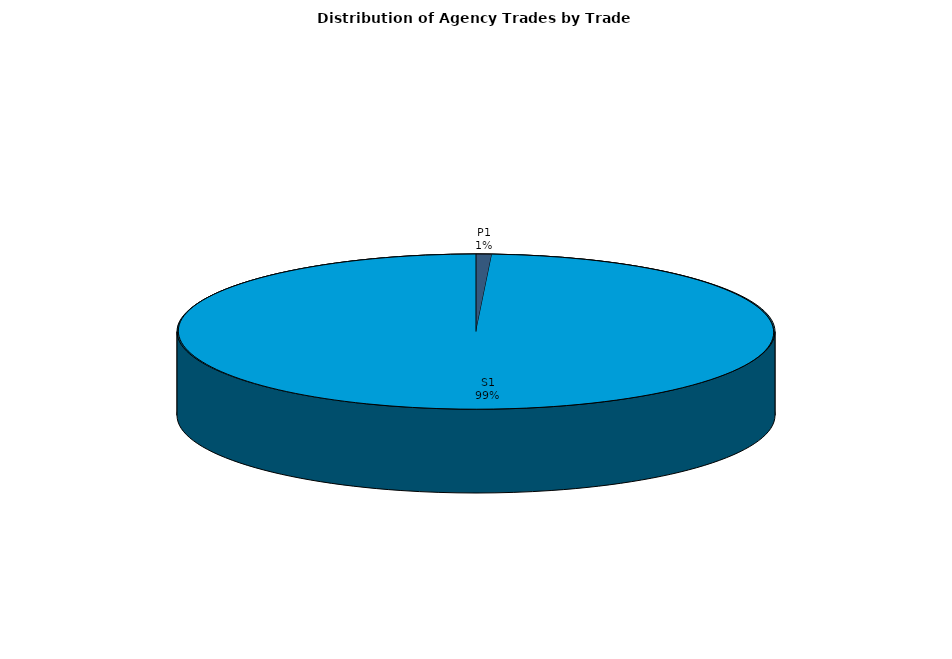
| Category | Series 0 |
|---|---|
| P1 | 13 |
| S1 | 1518.02 |